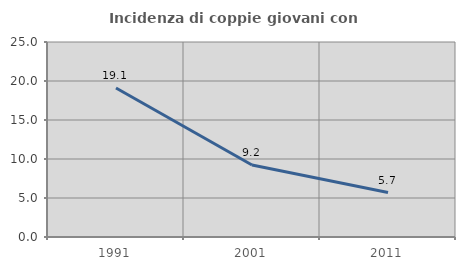
| Category | Incidenza di coppie giovani con figli |
|---|---|
| 1991.0 | 19.104 |
| 2001.0 | 9.227 |
| 2011.0 | 5.699 |